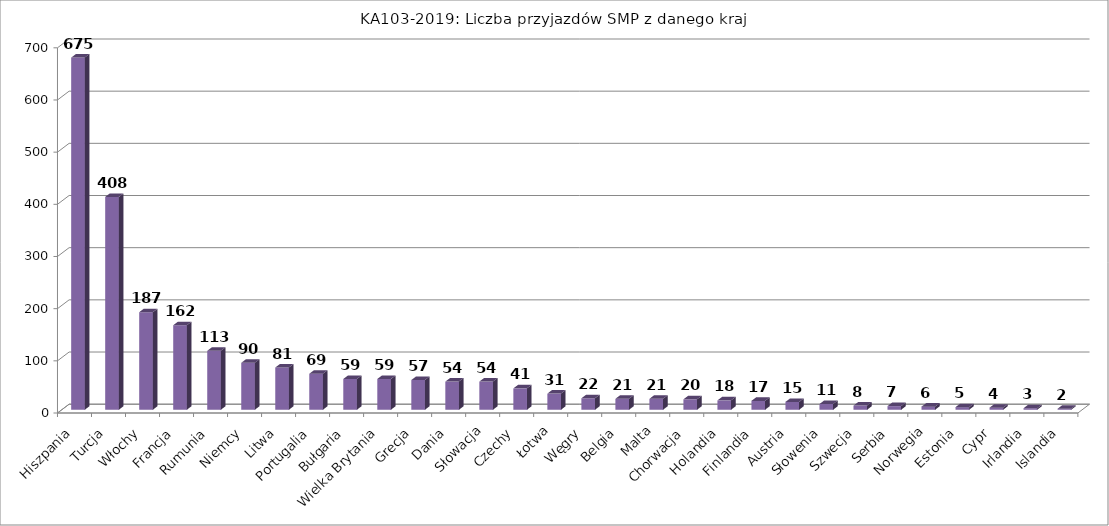
| Category | Liczba przyjazdów SMP |
|---|---|
| Hiszpania | 675 |
| Turcja | 408 |
| Włochy | 187 |
| Francja  | 162 |
| Rumunia | 113 |
| Niemcy | 90 |
| Litwa | 81 |
| Portugalia | 69 |
| Bułgaria | 59 |
| Wielka Brytania | 59 |
| Grecja | 57 |
| Dania | 54 |
| Słowacja | 54 |
| Czechy | 41 |
| Łotwa | 31 |
| Węgry | 22 |
| Belgia | 21 |
| Malta | 21 |
| Chorwacja | 20 |
| Holandia | 18 |
| Finlandia | 17 |
| Austria | 15 |
| Słowenia | 11 |
| Szwecja | 8 |
| Serbia | 7 |
| Norwegia | 6 |
| Estonia | 5 |
| Cypr | 4 |
| Irlandia | 3 |
| Islandia | 2 |